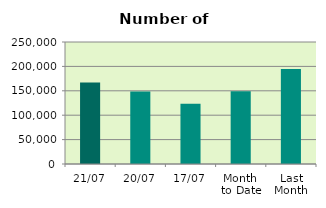
| Category | Series 0 |
|---|---|
| 21/07 | 166782 |
| 20/07 | 148394 |
| 17/07 | 123456 |
| Month 
to Date | 149091.867 |
| Last
Month | 194460.727 |